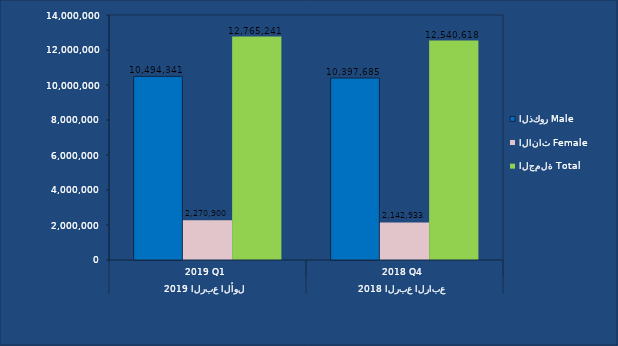
| Category | الذكور | الاناث | الجملة |
|---|---|---|---|
| 0 | 10494341 | 2270900 | 12765241 |
| 1 | 10397685 | 2142933 | 12540618 |